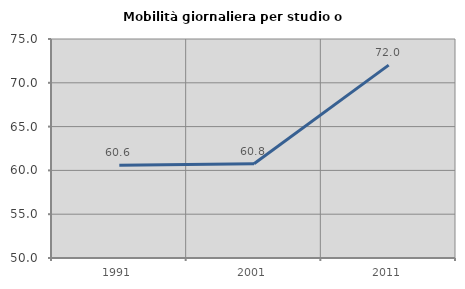
| Category | Mobilità giornaliera per studio o lavoro |
|---|---|
| 1991.0 | 60.601 |
| 2001.0 | 60.751 |
| 2011.0 | 72.018 |